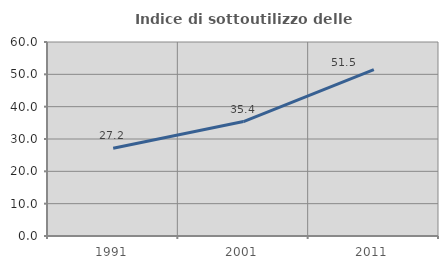
| Category | Indice di sottoutilizzo delle abitazioni  |
|---|---|
| 1991.0 | 27.163 |
| 2001.0 | 35.392 |
| 2011.0 | 51.475 |